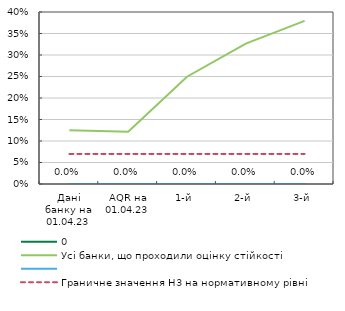
| Category | 0 | Усі банки, що проходили оцінку стійкості | Series 3 | Граничне значення Н3 на нормативному рівні |
|---|---|---|---|---|
| Дані банку на 01.04.23 | 0 | 0.125 | 0 | 0.07 |
| AQR на 01.04.23 | 0 | 0.121 | 0 | 0.07 |
| 1-й | 0 | 0.249 | 0 | 0.07 |
| 2-й | 0 | 0.327 | 0 | 0.07 |
| 3-й | 0 | 0.379 | 0 | 0.07 |